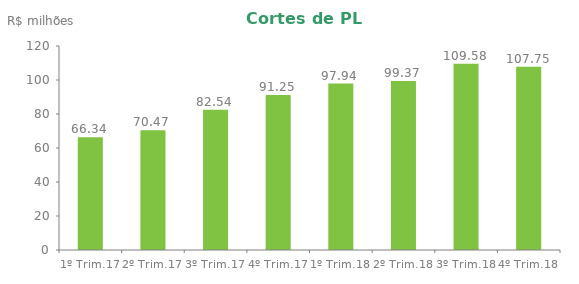
| Category | Series 0 |
|---|---|
| 1º Trim.17 | 66.342 |
| 2º Trim.17 | 70.469 |
| 3º Trim.17 | 82.54 |
| 4º Trim.17 | 91.247 |
| 1º Trim.18 | 97.937 |
| 2º Trim.18 | 99.374 |
| 3º Trim.18 | 109.58 |
| 4º Trim.18 | 107.752 |